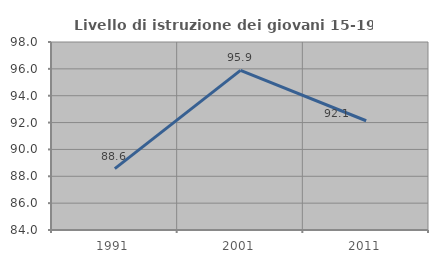
| Category | Livello di istruzione dei giovani 15-19 anni |
|---|---|
| 1991.0 | 88.571 |
| 2001.0 | 95.89 |
| 2011.0 | 92.135 |